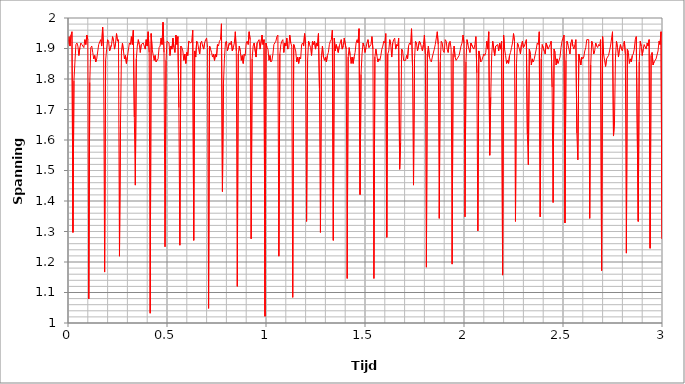
| Category | Series 0 |
|---|---|
| 0.0 | 1.913 |
| 0.005 | 1.939 |
| 0.01 | 1.908 |
| 0.015 | 1.944 |
| 0.02 | 1.955 |
| 0.025 | 1.297 |
| 0.03 | 1.794 |
| 0.035 | 1.856 |
| 0.04 | 1.913 |
| 0.045 | 1.918 |
| 0.05 | 1.908 |
| 0.055 | 1.877 |
| 0.06 | 1.903 |
| 0.065 | 1.918 |
| 0.07 | 1.913 |
| 0.075 | 1.913 |
| 0.08 | 1.903 |
| 0.085 | 1.929 |
| 0.09 | 1.913 |
| 0.095 | 1.944 |
| 0.1 | 1.929 |
| 0.105 | 1.079 |
| 0.11 | 1.789 |
| 0.115 | 1.903 |
| 0.12 | 1.908 |
| 0.125 | 1.887 |
| 0.13 | 1.866 |
| 0.135 | 1.877 |
| 0.14 | 1.856 |
| 0.145 | 1.866 |
| 0.15 | 1.866 |
| 0.155 | 1.913 |
| 0.16 | 1.913 |
| 0.165 | 1.929 |
| 0.17 | 1.908 |
| 0.175 | 1.97 |
| 0.18 | 1.898 |
| 0.185 | 1.167 |
| 0.19 | 1.861 |
| 0.195 | 1.898 |
| 0.2 | 1.929 |
| 0.205 | 1.924 |
| 0.21 | 1.892 |
| 0.215 | 1.892 |
| 0.22 | 1.913 |
| 0.225 | 1.939 |
| 0.23 | 1.924 |
| 0.235 | 1.898 |
| 0.24 | 1.918 |
| 0.245 | 1.949 |
| 0.25 | 1.924 |
| 0.255 | 1.929 |
| 0.26 | 1.219 |
| 0.265 | 1.649 |
| 0.27 | 1.892 |
| 0.275 | 1.918 |
| 0.28 | 1.892 |
| 0.285 | 1.866 |
| 0.29 | 1.877 |
| 0.295 | 1.851 |
| 0.3 | 1.872 |
| 0.305 | 1.872 |
| 0.31 | 1.918 |
| 0.315 | 1.913 |
| 0.32 | 1.939 |
| 0.325 | 1.913 |
| 0.33 | 1.96 |
| 0.335 | 1.675 |
| 0.34 | 1.452 |
| 0.345 | 1.866 |
| 0.35 | 1.908 |
| 0.355 | 1.929 |
| 0.36 | 1.913 |
| 0.365 | 1.887 |
| 0.37 | 1.913 |
| 0.375 | 1.913 |
| 0.38 | 1.918 |
| 0.385 | 1.908 |
| 0.39 | 1.898 |
| 0.395 | 1.929 |
| 0.4 | 1.908 |
| 0.405 | 1.955 |
| 0.41 | 1.887 |
| 0.415 | 1.032 |
| 0.42 | 1.949 |
| 0.425 | 1.898 |
| 0.43 | 1.898 |
| 0.435 | 1.861 |
| 0.44 | 1.877 |
| 0.445 | 1.856 |
| 0.45 | 1.861 |
| 0.455 | 1.866 |
| 0.46 | 1.903 |
| 0.465 | 1.908 |
| 0.47 | 1.934 |
| 0.475 | 1.913 |
| 0.48 | 1.986 |
| 0.485 | 1.887 |
| 0.49 | 1.25 |
| 0.495 | 1.861 |
| 0.5 | 1.924 |
| 0.505 | 1.924 |
| 0.51 | 1.918 |
| 0.515 | 1.877 |
| 0.52 | 1.908 |
| 0.525 | 1.898 |
| 0.53 | 1.934 |
| 0.535 | 1.903 |
| 0.54 | 1.887 |
| 0.545 | 1.944 |
| 0.55 | 1.913 |
| 0.555 | 1.939 |
| 0.56 | 1.706 |
| 0.565 | 1.255 |
| 0.57 | 1.908 |
| 0.575 | 1.903 |
| 0.58 | 1.892 |
| 0.585 | 1.861 |
| 0.59 | 1.882 |
| 0.595 | 1.851 |
| 0.6 | 1.887 |
| 0.605 | 1.877 |
| 0.61 | 1.924 |
| 0.615 | 1.924 |
| 0.62 | 1.918 |
| 0.625 | 1.924 |
| 0.63 | 1.96 |
| 0.635 | 1.271 |
| 0.64 | 1.892 |
| 0.645 | 1.872 |
| 0.65 | 1.924 |
| 0.655 | 1.918 |
| 0.66 | 1.898 |
| 0.665 | 1.882 |
| 0.67 | 1.918 |
| 0.675 | 1.924 |
| 0.68 | 1.908 |
| 0.685 | 1.898 |
| 0.69 | 1.918 |
| 0.695 | 1.929 |
| 0.7 | 1.934 |
| 0.705 | 1.903 |
| 0.71 | 1.048 |
| 0.715 | 1.908 |
| 0.72 | 1.898 |
| 0.725 | 1.887 |
| 0.73 | 1.872 |
| 0.735 | 1.882 |
| 0.74 | 1.861 |
| 0.745 | 1.882 |
| 0.75 | 1.872 |
| 0.755 | 1.913 |
| 0.76 | 1.908 |
| 0.765 | 1.924 |
| 0.77 | 1.929 |
| 0.775 | 1.981 |
| 0.78 | 1.431 |
| 0.785 | 1.783 |
| 0.79 | 1.866 |
| 0.795 | 1.918 |
| 0.8 | 1.924 |
| 0.805 | 1.892 |
| 0.81 | 1.892 |
| 0.815 | 1.918 |
| 0.82 | 1.913 |
| 0.825 | 1.924 |
| 0.83 | 1.892 |
| 0.835 | 1.903 |
| 0.84 | 1.918 |
| 0.845 | 1.955 |
| 0.85 | 1.892 |
| 0.855 | 1.12 |
| 0.86 | 1.882 |
| 0.865 | 1.908 |
| 0.87 | 1.892 |
| 0.875 | 1.861 |
| 0.88 | 1.877 |
| 0.885 | 1.851 |
| 0.89 | 1.882 |
| 0.895 | 1.877 |
| 0.9 | 1.918 |
| 0.905 | 1.924 |
| 0.91 | 1.913 |
| 0.915 | 1.955 |
| 0.92 | 1.929 |
| 0.925 | 1.276 |
| 0.93 | 1.866 |
| 0.935 | 1.908 |
| 0.94 | 1.918 |
| 0.945 | 1.918 |
| 0.95 | 1.872 |
| 0.955 | 1.918 |
| 0.96 | 1.918 |
| 0.965 | 1.929 |
| 0.97 | 1.898 |
| 0.975 | 1.898 |
| 0.98 | 1.944 |
| 0.985 | 1.913 |
| 0.99 | 1.929 |
| 0.995 | 1.022 |
| 1.0 | 1.918 |
| 1.005 | 1.903 |
| 1.01 | 1.898 |
| 1.015 | 1.861 |
| 1.02 | 1.877 |
| 1.025 | 1.856 |
| 1.03 | 1.861 |
| 1.035 | 1.882 |
| 1.04 | 1.913 |
| 1.045 | 1.913 |
| 1.05 | 1.924 |
| 1.055 | 1.939 |
| 1.06 | 1.944 |
| 1.065 | 1.219 |
| 1.07 | 1.882 |
| 1.075 | 1.913 |
| 1.08 | 1.924 |
| 1.085 | 1.929 |
| 1.09 | 1.887 |
| 1.095 | 1.918 |
| 1.1 | 1.908 |
| 1.105 | 1.934 |
| 1.11 | 1.898 |
| 1.115 | 1.903 |
| 1.12 | 1.944 |
| 1.125 | 1.918 |
| 1.13 | 1.908 |
| 1.135 | 1.084 |
| 1.14 | 1.913 |
| 1.145 | 1.903 |
| 1.15 | 1.892 |
| 1.155 | 1.856 |
| 1.16 | 1.872 |
| 1.165 | 1.851 |
| 1.17 | 1.872 |
| 1.175 | 1.866 |
| 1.18 | 1.913 |
| 1.185 | 1.918 |
| 1.19 | 1.908 |
| 1.195 | 1.949 |
| 1.2 | 1.913 |
| 1.205 | 1.333 |
| 1.21 | 1.861 |
| 1.215 | 1.924 |
| 1.22 | 1.913 |
| 1.225 | 1.903 |
| 1.23 | 1.877 |
| 1.235 | 1.924 |
| 1.24 | 1.913 |
| 1.245 | 1.924 |
| 1.25 | 1.898 |
| 1.255 | 1.918 |
| 1.26 | 1.908 |
| 1.265 | 1.949 |
| 1.27 | 1.768 |
| 1.275 | 1.297 |
| 1.28 | 1.877 |
| 1.285 | 1.908 |
| 1.29 | 1.872 |
| 1.295 | 1.861 |
| 1.3 | 1.872 |
| 1.305 | 1.856 |
| 1.31 | 1.877 |
| 1.315 | 1.887 |
| 1.32 | 1.913 |
| 1.325 | 1.924 |
| 1.33 | 1.929 |
| 1.335 | 1.96 |
| 1.34 | 1.271 |
| 1.345 | 1.934 |
| 1.35 | 1.892 |
| 1.355 | 1.913 |
| 1.36 | 1.913 |
| 1.365 | 1.887 |
| 1.37 | 1.908 |
| 1.375 | 1.908 |
| 1.38 | 1.929 |
| 1.385 | 1.898 |
| 1.39 | 1.908 |
| 1.395 | 1.934 |
| 1.4 | 1.934 |
| 1.405 | 1.898 |
| 1.41 | 1.146 |
| 1.415 | 1.872 |
| 1.42 | 1.903 |
| 1.425 | 1.877 |
| 1.43 | 1.851 |
| 1.435 | 1.872 |
| 1.44 | 1.851 |
| 1.445 | 1.872 |
| 1.45 | 1.887 |
| 1.455 | 1.918 |
| 1.46 | 1.929 |
| 1.465 | 1.918 |
| 1.47 | 1.965 |
| 1.475 | 1.421 |
| 1.48 | 1.815 |
| 1.485 | 1.882 |
| 1.49 | 1.918 |
| 1.495 | 1.908 |
| 1.5 | 1.887 |
| 1.505 | 1.903 |
| 1.51 | 1.918 |
| 1.515 | 1.929 |
| 1.52 | 1.903 |
| 1.525 | 1.908 |
| 1.53 | 1.913 |
| 1.535 | 1.939 |
| 1.54 | 1.898 |
| 1.545 | 1.146 |
| 1.55 | 1.872 |
| 1.555 | 1.898 |
| 1.56 | 1.877 |
| 1.565 | 1.856 |
| 1.57 | 1.866 |
| 1.575 | 1.861 |
| 1.58 | 1.877 |
| 1.585 | 1.898 |
| 1.59 | 1.908 |
| 1.595 | 1.924 |
| 1.6 | 1.918 |
| 1.605 | 1.949 |
| 1.61 | 1.281 |
| 1.615 | 1.882 |
| 1.62 | 1.892 |
| 1.625 | 1.929 |
| 1.63 | 1.913 |
| 1.635 | 1.872 |
| 1.64 | 1.918 |
| 1.645 | 1.929 |
| 1.65 | 1.934 |
| 1.655 | 1.898 |
| 1.66 | 1.913 |
| 1.665 | 1.908 |
| 1.67 | 1.934 |
| 1.675 | 1.504 |
| 1.68 | 1.592 |
| 1.685 | 1.898 |
| 1.69 | 1.892 |
| 1.695 | 1.861 |
| 1.7 | 1.861 |
| 1.705 | 1.861 |
| 1.71 | 1.877 |
| 1.715 | 1.866 |
| 1.72 | 1.908 |
| 1.725 | 1.918 |
| 1.73 | 1.913 |
| 1.735 | 1.965 |
| 1.74 | 1.841 |
| 1.745 | 1.452 |
| 1.75 | 1.866 |
| 1.755 | 1.924 |
| 1.76 | 1.918 |
| 1.765 | 1.892 |
| 1.77 | 1.892 |
| 1.775 | 1.924 |
| 1.78 | 1.918 |
| 1.785 | 1.903 |
| 1.79 | 1.892 |
| 1.795 | 1.913 |
| 1.8 | 1.944 |
| 1.805 | 1.882 |
| 1.81 | 1.183 |
| 1.815 | 1.882 |
| 1.82 | 1.908 |
| 1.825 | 1.872 |
| 1.83 | 1.861 |
| 1.835 | 1.856 |
| 1.84 | 1.872 |
| 1.845 | 1.872 |
| 1.85 | 1.898 |
| 1.855 | 1.913 |
| 1.86 | 1.913 |
| 1.865 | 1.955 |
| 1.87 | 1.913 |
| 1.875 | 1.343 |
| 1.88 | 1.856 |
| 1.885 | 1.924 |
| 1.89 | 1.918 |
| 1.895 | 1.892 |
| 1.9 | 1.887 |
| 1.905 | 1.929 |
| 1.91 | 1.924 |
| 1.915 | 1.898 |
| 1.92 | 1.887 |
| 1.925 | 1.918 |
| 1.93 | 1.924 |
| 1.935 | 1.898 |
| 1.94 | 1.193 |
| 1.945 | 1.882 |
| 1.95 | 1.908 |
| 1.955 | 1.872 |
| 1.96 | 1.861 |
| 1.965 | 1.866 |
| 1.97 | 1.866 |
| 1.975 | 1.877 |
| 1.98 | 1.892 |
| 1.985 | 1.908 |
| 1.99 | 1.918 |
| 1.995 | 1.944 |
| 2.0 | 1.918 |
| 2.005 | 1.348 |
| 2.01 | 1.856 |
| 2.015 | 1.929 |
| 2.02 | 1.913 |
| 2.025 | 1.898 |
| 2.03 | 1.887 |
| 2.035 | 1.918 |
| 2.04 | 1.918 |
| 2.045 | 1.903 |
| 2.05 | 1.898 |
| 2.055 | 1.913 |
| 2.06 | 1.939 |
| 2.065 | 1.82 |
| 2.07 | 1.302 |
| 2.075 | 1.892 |
| 2.08 | 1.892 |
| 2.085 | 1.856 |
| 2.09 | 1.861 |
| 2.095 | 1.861 |
| 2.1 | 1.882 |
| 2.105 | 1.877 |
| 2.11 | 1.887 |
| 2.115 | 1.924 |
| 2.12 | 1.898 |
| 2.125 | 1.955 |
| 2.13 | 1.55 |
| 2.135 | 1.742 |
| 2.14 | 1.882 |
| 2.145 | 1.924 |
| 2.15 | 1.924 |
| 2.155 | 1.877 |
| 2.16 | 1.908 |
| 2.165 | 1.908 |
| 2.17 | 1.913 |
| 2.175 | 1.892 |
| 2.18 | 1.918 |
| 2.185 | 1.898 |
| 2.19 | 1.924 |
| 2.195 | 1.157 |
| 2.2 | 1.944 |
| 2.205 | 1.898 |
| 2.21 | 1.877 |
| 2.215 | 1.851 |
| 2.22 | 1.861 |
| 2.225 | 1.851 |
| 2.23 | 1.877 |
| 2.235 | 1.887 |
| 2.24 | 1.903 |
| 2.245 | 1.918 |
| 2.25 | 1.949 |
| 2.255 | 1.924 |
| 2.26 | 1.333 |
| 2.265 | 1.851 |
| 2.27 | 1.918 |
| 2.275 | 1.908 |
| 2.28 | 1.898 |
| 2.285 | 1.882 |
| 2.29 | 1.913 |
| 2.295 | 1.924 |
| 2.3 | 1.903 |
| 2.305 | 1.908 |
| 2.31 | 1.908 |
| 2.315 | 1.929 |
| 2.32 | 1.618 |
| 2.325 | 1.519 |
| 2.33 | 1.898 |
| 2.335 | 1.882 |
| 2.34 | 1.846 |
| 2.345 | 1.866 |
| 2.35 | 1.856 |
| 2.355 | 1.866 |
| 2.36 | 1.882 |
| 2.365 | 1.898 |
| 2.37 | 1.918 |
| 2.375 | 1.913 |
| 2.38 | 1.955 |
| 2.385 | 1.348 |
| 2.39 | 1.866 |
| 2.395 | 1.913 |
| 2.4 | 1.913 |
| 2.405 | 1.892 |
| 2.41 | 1.882 |
| 2.415 | 1.918 |
| 2.42 | 1.918 |
| 2.425 | 1.898 |
| 2.43 | 1.898 |
| 2.435 | 1.913 |
| 2.44 | 1.924 |
| 2.445 | 1.773 |
| 2.45 | 1.395 |
| 2.455 | 1.898 |
| 2.46 | 1.887 |
| 2.465 | 1.846 |
| 2.47 | 1.866 |
| 2.475 | 1.851 |
| 2.48 | 1.861 |
| 2.485 | 1.872 |
| 2.49 | 1.903 |
| 2.495 | 1.924 |
| 2.5 | 1.934 |
| 2.505 | 1.944 |
| 2.51 | 1.328 |
| 2.515 | 1.861 |
| 2.52 | 1.924 |
| 2.525 | 1.913 |
| 2.53 | 1.898 |
| 2.535 | 1.882 |
| 2.54 | 1.918 |
| 2.545 | 1.929 |
| 2.55 | 1.908 |
| 2.555 | 1.898 |
| 2.56 | 1.913 |
| 2.565 | 1.929 |
| 2.57 | 1.623 |
| 2.575 | 1.535 |
| 2.58 | 1.882 |
| 2.585 | 1.882 |
| 2.59 | 1.846 |
| 2.595 | 1.872 |
| 2.6 | 1.866 |
| 2.605 | 1.872 |
| 2.61 | 1.892 |
| 2.615 | 1.903 |
| 2.62 | 1.929 |
| 2.625 | 1.929 |
| 2.63 | 1.929 |
| 2.635 | 1.343 |
| 2.64 | 1.846 |
| 2.645 | 1.924 |
| 2.65 | 1.913 |
| 2.655 | 1.882 |
| 2.66 | 1.892 |
| 2.665 | 1.918 |
| 2.67 | 1.908 |
| 2.675 | 1.903 |
| 2.68 | 1.913 |
| 2.685 | 1.908 |
| 2.69 | 1.929 |
| 2.695 | 1.172 |
| 2.7 | 1.939 |
| 2.705 | 1.882 |
| 2.71 | 1.861 |
| 2.715 | 1.841 |
| 2.72 | 1.866 |
| 2.725 | 1.872 |
| 2.73 | 1.877 |
| 2.735 | 1.892 |
| 2.74 | 1.908 |
| 2.745 | 1.908 |
| 2.75 | 1.955 |
| 2.755 | 1.613 |
| 2.76 | 1.659 |
| 2.765 | 1.872 |
| 2.77 | 1.924 |
| 2.775 | 1.903 |
| 2.78 | 1.872 |
| 2.785 | 1.898 |
| 2.79 | 1.913 |
| 2.795 | 1.898 |
| 2.8 | 1.892 |
| 2.805 | 1.913 |
| 2.81 | 1.924 |
| 2.815 | 1.882 |
| 2.82 | 1.229 |
| 2.825 | 1.898 |
| 2.83 | 1.887 |
| 2.835 | 1.851 |
| 2.84 | 1.866 |
| 2.845 | 1.856 |
| 2.85 | 1.877 |
| 2.855 | 1.882 |
| 2.86 | 1.898 |
| 2.865 | 1.929 |
| 2.87 | 1.939 |
| 2.875 | 1.939 |
| 2.88 | 1.333 |
| 2.885 | 1.856 |
| 2.89 | 1.924 |
| 2.895 | 1.908 |
| 2.9 | 1.877 |
| 2.905 | 1.898 |
| 2.91 | 1.913 |
| 2.915 | 1.913 |
| 2.92 | 1.898 |
| 2.925 | 1.918 |
| 2.93 | 1.908 |
| 2.935 | 1.929 |
| 2.94 | 1.245 |
| 2.945 | 1.877 |
| 2.95 | 1.887 |
| 2.955 | 1.846 |
| 2.96 | 1.856 |
| 2.965 | 1.856 |
| 2.97 | 1.866 |
| 2.975 | 1.866 |
| 2.98 | 1.892 |
| 2.985 | 1.924 |
| 2.99 | 1.913 |
| 2.995 | 1.955 |
| 3.0 | 1.276 |